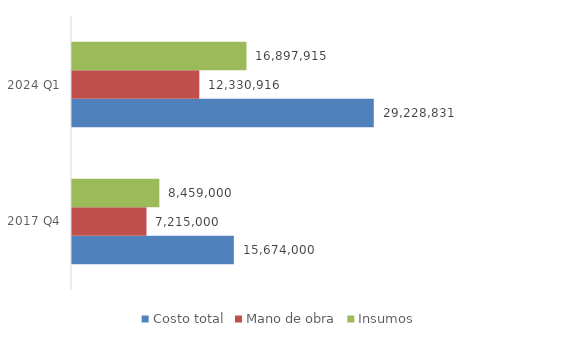
| Category | Costo total | Mano de obra | Insumos |
|---|---|---|---|
| 2017 Q4 | 15674000 | 7215000 | 8459000 |
| 2024 Q1 | 29228831.127 | 12330916 | 16897915.127 |